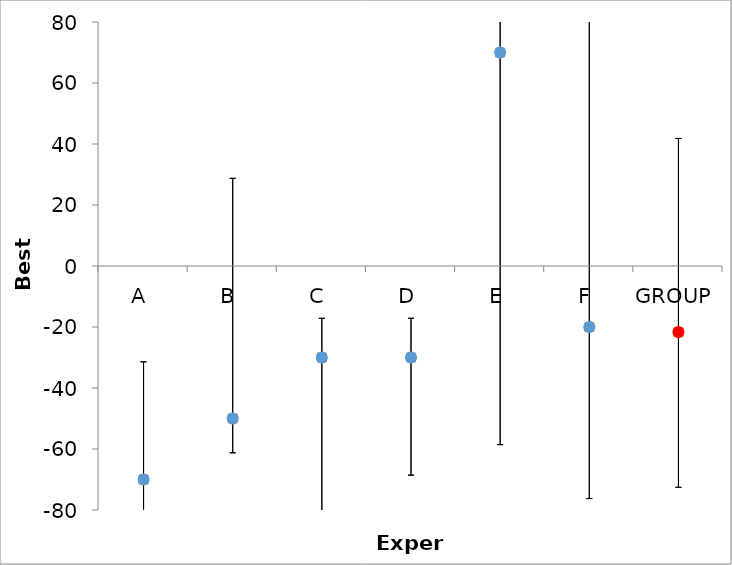
| Category | Series 1 | Series 0 |
|---|---|---|
| A | -70 | -70 |
| B | -50 | -50 |
| C | -30 | -30 |
| D | -30 | -30 |
| E | 70 | 70 |
| F | -20 | -20 |
| GROUP | -21.667 | -21.667 |